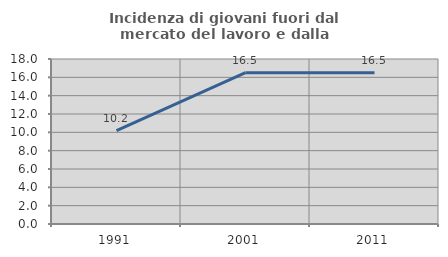
| Category | Incidenza di giovani fuori dal mercato del lavoro e dalla formazione  |
|---|---|
| 1991.0 | 10.184 |
| 2001.0 | 16.511 |
| 2011.0 | 16.493 |